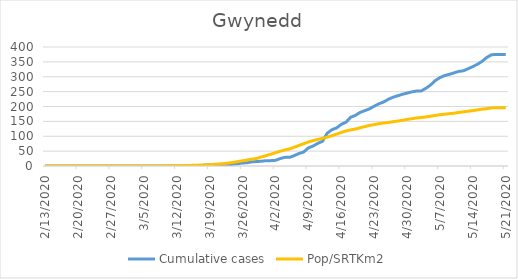
| Category | Cumulative cases | Pop/SRTKm2 |
|---|---|---|
| 5/21/20 | 375 | 196.179 |
| 5/20/20 | 375 | 196.179 |
| 5/19/20 | 375 | 196.133 |
| 5/18/20 | 374 | 195.058 |
| 5/17/20 | 365 | 192.769 |
| 5/16/20 | 352 | 191.064 |
| 5/15/20 | 342 | 188.667 |
| 5/14/20 | 334 | 186.01 |
| 5/13/20 | 327 | 184.166 |
| 5/12/20 | 320 | 182.047 |
| 5/11/20 | 318 | 179.942 |
| 5/10/20 | 313 | 177.331 |
| 5/9/20 | 308 | 175.81 |
| 5/8/20 | 304 | 173.905 |
| 5/7/20 | 297 | 172.369 |
| 5/6/20 | 287 | 169.834 |
| 5/5/20 | 272 | 167.3 |
| 5/4/20 | 261 | 164.857 |
| 5/3/20 | 252 | 162.891 |
| 5/2/20 | 252 | 161.447 |
| 5/1/20 | 249 | 158.882 |
| 4/30/20 | 245 | 156.455 |
| 4/29/20 | 241 | 153.505 |
| 4/28/20 | 236 | 151.001 |
| 4/27/20 | 231 | 148.759 |
| 4/26/20 | 224 | 146.239 |
| 4/25/20 | 215 | 144.411 |
| 4/24/20 | 209 | 142.338 |
| 4/23/20 | 201 | 139.158 |
| 4/22/20 | 192 | 136.116 |
| 4/21/20 | 186 | 132.261 |
| 4/20/20 | 180 | 128.374 |
| 4/19/20 | 170 | 124.15 |
| 4/18/20 | 164 | 121.416 |
| 4/17/20 | 147 | 117.683 |
| 4/16/20 | 140 | 112.736 |
| 4/15/20 | 128 | 107.222 |
| 4/14/20 | 122 | 101.768 |
| 4/13/20 | 110 | 97.006 |
| 4/12/20 | 83 | 92.905 |
| 4/11/20 | 76 | 89.172 |
| 4/10/20 | 67 | 85.424 |
| 4/9/20 | 61 | 80.816 |
| 4/8/20 | 47 | 74.825 |
| 4/7/20 | 42 | 68.941 |
| 4/6/20 | 35 | 63.166 |
| 4/5/20 | 29 | 57.344 |
| 4/4/20 | 29 | 53.949 |
| 4/3/20 | 25 | 49.632 |
| 4/2/20 | 19 | 44.655 |
| 4/1/20 | 18 | 39.54 |
| 3/31/20 | 18 | 34.624 |
| 3/30/20 | 16 | 30.461 |
| 3/29/20 | 15 | 25.331 |
| 3/28/20 | 14 | 22.934 |
| 3/27/20 | 11 | 20.384 |
| 3/26/20 | 10 | 17.543 |
| 3/25/20 | 8 | 14.87 |
| 3/24/20 | 6 | 12.059 |
| 3/23/20 | 4 | 9.985 |
| 3/22/20 | 4 | 7.988 |
| 3/21/20 | 4 | 6.82 |
| 3/20/20 | 4 | 5.668 |
| 3/19/20 | 4 | 4.562 |
| 3/18/20 | 3 | 3.641 |
| 3/17/20 | 1 | 3.103 |
| 3/16/20 | 1 | 2.535 |
| 3/15/20 | 0 | 2.012 |
| 3/14/20 | 0 | 1.567 |
| 3/13/20 | 0 | 1.275 |
| 3/12/20 | 0 | 0.86 |
| 3/11/20 | 0 | 0.492 |
| 3/10/20 | 0 | 0.277 |
| 3/9/20 | 0 | 0.108 |
| 3/8/20 | 0 | 0.061 |
| 3/7/20 | 0 | 0.061 |
| 3/6/20 | 0 | 0.031 |
| 3/5/20 | 0 | 0.031 |
| 3/4/20 | 0 | 0.031 |
| 3/3/20 | 0 | 0.015 |
| 3/2/20 | 0 | 0.015 |
| 3/1/20 | 0 | 0.015 |
| 2/29/20 | 0 | 0.015 |
| 2/28/20 | 0 | 0.015 |
| 2/27/20 | 0 | 0.015 |
| 2/26/20 | 0 | 0 |
| 2/25/20 | 0 | 0 |
| 2/24/20 | 0 | 0 |
| 2/23/20 | 0 | 0 |
| 2/22/20 | 0 | 0 |
| 2/21/20 | 0 | 0 |
| 2/20/20 | 0 | 0 |
| 2/19/20 | 0 | 0 |
| 2/18/20 | 0 | 0 |
| 2/17/20 | 0 | 0 |
| 2/16/20 | 0 | 0 |
| 2/15/20 | 0 | 0 |
| 2/14/20 | 0 | 0 |
| 2/13/20 | 0 | 0 |